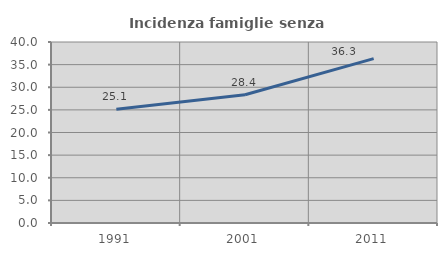
| Category | Incidenza famiglie senza nuclei |
|---|---|
| 1991.0 | 25.137 |
| 2001.0 | 28.351 |
| 2011.0 | 36.335 |